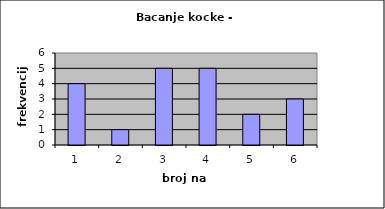
| Category | Series 0 |
|---|---|
| 0 | 4 |
| 1 | 1 |
| 2 | 5 |
| 3 | 5 |
| 4 | 2 |
| 5 | 3 |